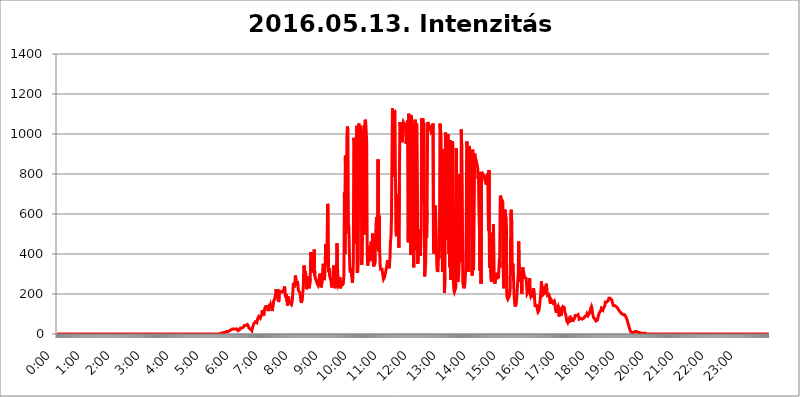
| Category | 2016.05.13. Intenzitás [W/m^2] |
|---|---|
| 0.0 | 0 |
| 0.0006944444444444445 | 0 |
| 0.001388888888888889 | 0 |
| 0.0020833333333333333 | 0 |
| 0.002777777777777778 | 0 |
| 0.003472222222222222 | 0 |
| 0.004166666666666667 | 0 |
| 0.004861111111111111 | 0 |
| 0.005555555555555556 | 0 |
| 0.0062499999999999995 | 0 |
| 0.006944444444444444 | 0 |
| 0.007638888888888889 | 0 |
| 0.008333333333333333 | 0 |
| 0.009027777777777779 | 0 |
| 0.009722222222222222 | 0 |
| 0.010416666666666666 | 0 |
| 0.011111111111111112 | 0 |
| 0.011805555555555555 | 0 |
| 0.012499999999999999 | 0 |
| 0.013194444444444444 | 0 |
| 0.013888888888888888 | 0 |
| 0.014583333333333332 | 0 |
| 0.015277777777777777 | 0 |
| 0.015972222222222224 | 0 |
| 0.016666666666666666 | 0 |
| 0.017361111111111112 | 0 |
| 0.018055555555555557 | 0 |
| 0.01875 | 0 |
| 0.019444444444444445 | 0 |
| 0.02013888888888889 | 0 |
| 0.020833333333333332 | 0 |
| 0.02152777777777778 | 0 |
| 0.022222222222222223 | 0 |
| 0.02291666666666667 | 0 |
| 0.02361111111111111 | 0 |
| 0.024305555555555556 | 0 |
| 0.024999999999999998 | 0 |
| 0.025694444444444447 | 0 |
| 0.02638888888888889 | 0 |
| 0.027083333333333334 | 0 |
| 0.027777777777777776 | 0 |
| 0.02847222222222222 | 0 |
| 0.029166666666666664 | 0 |
| 0.029861111111111113 | 0 |
| 0.030555555555555555 | 0 |
| 0.03125 | 0 |
| 0.03194444444444445 | 0 |
| 0.03263888888888889 | 0 |
| 0.03333333333333333 | 0 |
| 0.034027777777777775 | 0 |
| 0.034722222222222224 | 0 |
| 0.035416666666666666 | 0 |
| 0.036111111111111115 | 0 |
| 0.03680555555555556 | 0 |
| 0.0375 | 0 |
| 0.03819444444444444 | 0 |
| 0.03888888888888889 | 0 |
| 0.03958333333333333 | 0 |
| 0.04027777777777778 | 0 |
| 0.04097222222222222 | 0 |
| 0.041666666666666664 | 0 |
| 0.042361111111111106 | 0 |
| 0.04305555555555556 | 0 |
| 0.043750000000000004 | 0 |
| 0.044444444444444446 | 0 |
| 0.04513888888888889 | 0 |
| 0.04583333333333334 | 0 |
| 0.04652777777777778 | 0 |
| 0.04722222222222222 | 0 |
| 0.04791666666666666 | 0 |
| 0.04861111111111111 | 0 |
| 0.049305555555555554 | 0 |
| 0.049999999999999996 | 0 |
| 0.05069444444444445 | 0 |
| 0.051388888888888894 | 0 |
| 0.052083333333333336 | 0 |
| 0.05277777777777778 | 0 |
| 0.05347222222222222 | 0 |
| 0.05416666666666667 | 0 |
| 0.05486111111111111 | 0 |
| 0.05555555555555555 | 0 |
| 0.05625 | 0 |
| 0.05694444444444444 | 0 |
| 0.057638888888888885 | 0 |
| 0.05833333333333333 | 0 |
| 0.05902777777777778 | 0 |
| 0.059722222222222225 | 0 |
| 0.06041666666666667 | 0 |
| 0.061111111111111116 | 0 |
| 0.06180555555555556 | 0 |
| 0.0625 | 0 |
| 0.06319444444444444 | 0 |
| 0.06388888888888888 | 0 |
| 0.06458333333333334 | 0 |
| 0.06527777777777778 | 0 |
| 0.06597222222222222 | 0 |
| 0.06666666666666667 | 0 |
| 0.06736111111111111 | 0 |
| 0.06805555555555555 | 0 |
| 0.06874999999999999 | 0 |
| 0.06944444444444443 | 0 |
| 0.07013888888888889 | 0 |
| 0.07083333333333333 | 0 |
| 0.07152777777777779 | 0 |
| 0.07222222222222223 | 0 |
| 0.07291666666666667 | 0 |
| 0.07361111111111111 | 0 |
| 0.07430555555555556 | 0 |
| 0.075 | 0 |
| 0.07569444444444444 | 0 |
| 0.0763888888888889 | 0 |
| 0.07708333333333334 | 0 |
| 0.07777777777777778 | 0 |
| 0.07847222222222222 | 0 |
| 0.07916666666666666 | 0 |
| 0.0798611111111111 | 0 |
| 0.08055555555555556 | 0 |
| 0.08125 | 0 |
| 0.08194444444444444 | 0 |
| 0.08263888888888889 | 0 |
| 0.08333333333333333 | 0 |
| 0.08402777777777777 | 0 |
| 0.08472222222222221 | 0 |
| 0.08541666666666665 | 0 |
| 0.08611111111111112 | 0 |
| 0.08680555555555557 | 0 |
| 0.08750000000000001 | 0 |
| 0.08819444444444445 | 0 |
| 0.08888888888888889 | 0 |
| 0.08958333333333333 | 0 |
| 0.09027777777777778 | 0 |
| 0.09097222222222222 | 0 |
| 0.09166666666666667 | 0 |
| 0.09236111111111112 | 0 |
| 0.09305555555555556 | 0 |
| 0.09375 | 0 |
| 0.09444444444444444 | 0 |
| 0.09513888888888888 | 0 |
| 0.09583333333333333 | 0 |
| 0.09652777777777777 | 0 |
| 0.09722222222222222 | 0 |
| 0.09791666666666667 | 0 |
| 0.09861111111111111 | 0 |
| 0.09930555555555555 | 0 |
| 0.09999999999999999 | 0 |
| 0.10069444444444443 | 0 |
| 0.1013888888888889 | 0 |
| 0.10208333333333335 | 0 |
| 0.10277777777777779 | 0 |
| 0.10347222222222223 | 0 |
| 0.10416666666666667 | 0 |
| 0.10486111111111111 | 0 |
| 0.10555555555555556 | 0 |
| 0.10625 | 0 |
| 0.10694444444444444 | 0 |
| 0.1076388888888889 | 0 |
| 0.10833333333333334 | 0 |
| 0.10902777777777778 | 0 |
| 0.10972222222222222 | 0 |
| 0.1111111111111111 | 0 |
| 0.11180555555555556 | 0 |
| 0.11180555555555556 | 0 |
| 0.1125 | 0 |
| 0.11319444444444444 | 0 |
| 0.11388888888888889 | 0 |
| 0.11458333333333333 | 0 |
| 0.11527777777777777 | 0 |
| 0.11597222222222221 | 0 |
| 0.11666666666666665 | 0 |
| 0.1173611111111111 | 0 |
| 0.11805555555555557 | 0 |
| 0.11944444444444445 | 0 |
| 0.12013888888888889 | 0 |
| 0.12083333333333333 | 0 |
| 0.12152777777777778 | 0 |
| 0.12222222222222223 | 0 |
| 0.12291666666666667 | 0 |
| 0.12291666666666667 | 0 |
| 0.12361111111111112 | 0 |
| 0.12430555555555556 | 0 |
| 0.125 | 0 |
| 0.12569444444444444 | 0 |
| 0.12638888888888888 | 0 |
| 0.12708333333333333 | 0 |
| 0.16875 | 0 |
| 0.12847222222222224 | 0 |
| 0.12916666666666668 | 0 |
| 0.12986111111111112 | 0 |
| 0.13055555555555556 | 0 |
| 0.13125 | 0 |
| 0.13194444444444445 | 0 |
| 0.1326388888888889 | 0 |
| 0.13333333333333333 | 0 |
| 0.13402777777777777 | 0 |
| 0.13402777777777777 | 0 |
| 0.13472222222222222 | 0 |
| 0.13541666666666666 | 0 |
| 0.1361111111111111 | 0 |
| 0.13749999999999998 | 0 |
| 0.13819444444444443 | 0 |
| 0.1388888888888889 | 0 |
| 0.13958333333333334 | 0 |
| 0.14027777777777778 | 0 |
| 0.14097222222222222 | 0 |
| 0.14166666666666666 | 0 |
| 0.1423611111111111 | 0 |
| 0.14305555555555557 | 0 |
| 0.14375000000000002 | 0 |
| 0.14444444444444446 | 0 |
| 0.1451388888888889 | 0 |
| 0.1451388888888889 | 0 |
| 0.14652777777777778 | 0 |
| 0.14722222222222223 | 0 |
| 0.14791666666666667 | 0 |
| 0.1486111111111111 | 0 |
| 0.14930555555555555 | 0 |
| 0.15 | 0 |
| 0.15069444444444444 | 0 |
| 0.15138888888888888 | 0 |
| 0.15208333333333332 | 0 |
| 0.15277777777777776 | 0 |
| 0.15347222222222223 | 0 |
| 0.15416666666666667 | 0 |
| 0.15486111111111112 | 0 |
| 0.15555555555555556 | 0 |
| 0.15625 | 0 |
| 0.15694444444444444 | 0 |
| 0.15763888888888888 | 0 |
| 0.15833333333333333 | 0 |
| 0.15902777777777777 | 0 |
| 0.15972222222222224 | 0 |
| 0.16041666666666668 | 0 |
| 0.16111111111111112 | 0 |
| 0.16180555555555556 | 0 |
| 0.1625 | 0 |
| 0.16319444444444445 | 0 |
| 0.1638888888888889 | 0 |
| 0.16458333333333333 | 0 |
| 0.16527777777777777 | 0 |
| 0.16597222222222222 | 0 |
| 0.16666666666666666 | 0 |
| 0.1673611111111111 | 0 |
| 0.16805555555555554 | 0 |
| 0.16874999999999998 | 0 |
| 0.16944444444444443 | 0 |
| 0.17013888888888887 | 0 |
| 0.1708333333333333 | 0 |
| 0.17152777777777775 | 0 |
| 0.17222222222222225 | 0 |
| 0.1729166666666667 | 0 |
| 0.17361111111111113 | 0 |
| 0.17430555555555557 | 0 |
| 0.17500000000000002 | 0 |
| 0.17569444444444446 | 0 |
| 0.1763888888888889 | 0 |
| 0.17708333333333334 | 0 |
| 0.17777777777777778 | 0 |
| 0.17847222222222223 | 0 |
| 0.17916666666666667 | 0 |
| 0.1798611111111111 | 0 |
| 0.18055555555555555 | 0 |
| 0.18125 | 0 |
| 0.18194444444444444 | 0 |
| 0.1826388888888889 | 0 |
| 0.18333333333333335 | 0 |
| 0.1840277777777778 | 0 |
| 0.18472222222222223 | 0 |
| 0.18541666666666667 | 0 |
| 0.18611111111111112 | 0 |
| 0.18680555555555556 | 0 |
| 0.1875 | 0 |
| 0.18819444444444444 | 0 |
| 0.18888888888888888 | 0 |
| 0.18958333333333333 | 0 |
| 0.19027777777777777 | 0 |
| 0.1909722222222222 | 0 |
| 0.19166666666666665 | 0 |
| 0.19236111111111112 | 0 |
| 0.19305555555555554 | 0 |
| 0.19375 | 0 |
| 0.19444444444444445 | 0 |
| 0.1951388888888889 | 0 |
| 0.19583333333333333 | 0 |
| 0.19652777777777777 | 0 |
| 0.19722222222222222 | 0 |
| 0.19791666666666666 | 0 |
| 0.1986111111111111 | 0 |
| 0.19930555555555554 | 0 |
| 0.19999999999999998 | 0 |
| 0.20069444444444443 | 0 |
| 0.20138888888888887 | 0 |
| 0.2020833333333333 | 0 |
| 0.2027777777777778 | 0 |
| 0.2034722222222222 | 0 |
| 0.2041666666666667 | 0 |
| 0.20486111111111113 | 0 |
| 0.20555555555555557 | 0 |
| 0.20625000000000002 | 0 |
| 0.20694444444444446 | 0 |
| 0.2076388888888889 | 0 |
| 0.20833333333333334 | 0 |
| 0.20902777777777778 | 0 |
| 0.20972222222222223 | 0 |
| 0.21041666666666667 | 0 |
| 0.2111111111111111 | 0 |
| 0.21180555555555555 | 0 |
| 0.2125 | 0 |
| 0.21319444444444444 | 0 |
| 0.2138888888888889 | 0 |
| 0.21458333333333335 | 0 |
| 0.2152777777777778 | 0 |
| 0.21597222222222223 | 0 |
| 0.21666666666666667 | 0 |
| 0.21736111111111112 | 0 |
| 0.21805555555555556 | 0 |
| 0.21875 | 0 |
| 0.21944444444444444 | 0 |
| 0.22013888888888888 | 0 |
| 0.22083333333333333 | 0 |
| 0.22152777777777777 | 0 |
| 0.2222222222222222 | 0 |
| 0.22291666666666665 | 0 |
| 0.2236111111111111 | 0 |
| 0.22430555555555556 | 0 |
| 0.225 | 0 |
| 0.22569444444444445 | 0 |
| 0.2263888888888889 | 0 |
| 0.22708333333333333 | 0 |
| 0.22777777777777777 | 0 |
| 0.22847222222222222 | 3.525 |
| 0.22916666666666666 | 3.525 |
| 0.2298611111111111 | 3.525 |
| 0.23055555555555554 | 3.525 |
| 0.23124999999999998 | 3.525 |
| 0.23194444444444443 | 3.525 |
| 0.23263888888888887 | 7.887 |
| 0.2333333333333333 | 7.887 |
| 0.2340277777777778 | 7.887 |
| 0.2347222222222222 | 7.887 |
| 0.2354166666666667 | 7.887 |
| 0.23611111111111113 | 7.887 |
| 0.23680555555555557 | 12.257 |
| 0.23750000000000002 | 12.257 |
| 0.23819444444444446 | 12.257 |
| 0.2388888888888889 | 12.257 |
| 0.23958333333333334 | 12.257 |
| 0.24027777777777778 | 16.636 |
| 0.24097222222222223 | 16.636 |
| 0.24166666666666667 | 16.636 |
| 0.2423611111111111 | 16.636 |
| 0.24305555555555555 | 21.024 |
| 0.24375 | 21.024 |
| 0.24444444444444446 | 21.024 |
| 0.24513888888888888 | 21.024 |
| 0.24583333333333335 | 25.419 |
| 0.2465277777777778 | 25.419 |
| 0.24722222222222223 | 25.419 |
| 0.24791666666666667 | 25.419 |
| 0.24861111111111112 | 25.419 |
| 0.24930555555555556 | 25.419 |
| 0.25 | 25.419 |
| 0.25069444444444444 | 29.823 |
| 0.2513888888888889 | 29.823 |
| 0.2520833333333333 | 25.419 |
| 0.25277777777777777 | 21.024 |
| 0.2534722222222222 | 16.636 |
| 0.25416666666666665 | 16.636 |
| 0.2548611111111111 | 16.636 |
| 0.2555555555555556 | 21.024 |
| 0.25625000000000003 | 21.024 |
| 0.2569444444444445 | 29.823 |
| 0.2576388888888889 | 29.823 |
| 0.25833333333333336 | 25.419 |
| 0.2590277777777778 | 29.823 |
| 0.25972222222222224 | 29.823 |
| 0.2604166666666667 | 34.234 |
| 0.2611111111111111 | 34.234 |
| 0.26180555555555557 | 34.234 |
| 0.2625 | 43.079 |
| 0.26319444444444445 | 47.511 |
| 0.2638888888888889 | 47.511 |
| 0.26458333333333334 | 43.079 |
| 0.2652777777777778 | 43.079 |
| 0.2659722222222222 | 38.653 |
| 0.26666666666666666 | 47.511 |
| 0.2673611111111111 | 43.079 |
| 0.26805555555555555 | 38.653 |
| 0.26875 | 29.823 |
| 0.26944444444444443 | 29.823 |
| 0.2701388888888889 | 29.823 |
| 0.2708333333333333 | 25.419 |
| 0.27152777777777776 | 21.024 |
| 0.2722222222222222 | 21.024 |
| 0.27291666666666664 | 16.636 |
| 0.2736111111111111 | 29.823 |
| 0.2743055555555555 | 25.419 |
| 0.27499999999999997 | 43.079 |
| 0.27569444444444446 | 51.951 |
| 0.27638888888888885 | 47.511 |
| 0.27708333333333335 | 51.951 |
| 0.2777777777777778 | 60.85 |
| 0.27847222222222223 | 56.398 |
| 0.2791666666666667 | 56.398 |
| 0.2798611111111111 | 56.398 |
| 0.28055555555555556 | 60.85 |
| 0.28125 | 78.722 |
| 0.28194444444444444 | 83.205 |
| 0.2826388888888889 | 87.692 |
| 0.2833333333333333 | 83.205 |
| 0.28402777777777777 | 87.692 |
| 0.2847222222222222 | 78.722 |
| 0.28541666666666665 | 74.246 |
| 0.28611111111111115 | 74.246 |
| 0.28680555555555554 | 96.682 |
| 0.28750000000000003 | 119.235 |
| 0.2881944444444445 | 123.758 |
| 0.2888888888888889 | 105.69 |
| 0.28958333333333336 | 92.184 |
| 0.2902777777777778 | 110.201 |
| 0.29097222222222224 | 128.284 |
| 0.2916666666666667 | 132.814 |
| 0.2923611111111111 | 137.347 |
| 0.29305555555555557 | 137.347 |
| 0.29375 | 141.884 |
| 0.29444444444444445 | 137.347 |
| 0.2951388888888889 | 123.758 |
| 0.29583333333333334 | 114.716 |
| 0.2965277777777778 | 128.284 |
| 0.2972222222222222 | 141.884 |
| 0.29791666666666666 | 150.964 |
| 0.2986111111111111 | 137.347 |
| 0.29930555555555555 | 146.423 |
| 0.3 | 146.423 |
| 0.30069444444444443 | 128.284 |
| 0.3013888888888889 | 114.716 |
| 0.3020833333333333 | 132.814 |
| 0.30277777777777776 | 141.884 |
| 0.3034722222222222 | 164.605 |
| 0.30416666666666664 | 169.156 |
| 0.3048611111111111 | 173.709 |
| 0.3055555555555555 | 169.156 |
| 0.30624999999999997 | 201.058 |
| 0.3069444444444444 | 223.873 |
| 0.3076388888888889 | 219.309 |
| 0.30833333333333335 | 201.058 |
| 0.3090277777777778 | 182.82 |
| 0.30972222222222223 | 173.709 |
| 0.3104166666666667 | 160.056 |
| 0.3111111111111111 | 169.156 |
| 0.31180555555555556 | 214.746 |
| 0.3125 | 219.309 |
| 0.31319444444444444 | 210.182 |
| 0.3138888888888889 | 210.182 |
| 0.3145833333333333 | 214.746 |
| 0.31527777777777777 | 214.746 |
| 0.3159722222222222 | 210.182 |
| 0.31666666666666665 | 210.182 |
| 0.31736111111111115 | 210.182 |
| 0.31805555555555554 | 223.873 |
| 0.31875000000000003 | 237.564 |
| 0.3194444444444445 | 210.182 |
| 0.3201388888888889 | 182.82 |
| 0.32083333333333336 | 201.058 |
| 0.3215277777777778 | 196.497 |
| 0.32222222222222224 | 164.605 |
| 0.3229166666666667 | 141.884 |
| 0.3236111111111111 | 164.605 |
| 0.32430555555555557 | 187.378 |
| 0.325 | 164.605 |
| 0.32569444444444445 | 160.056 |
| 0.3263888888888889 | 155.509 |
| 0.32708333333333334 | 160.056 |
| 0.3277777777777778 | 160.056 |
| 0.3284722222222222 | 146.423 |
| 0.32916666666666666 | 155.509 |
| 0.3298611111111111 | 173.709 |
| 0.33055555555555555 | 219.309 |
| 0.33125 | 255.813 |
| 0.33194444444444443 | 233 |
| 0.3326388888888889 | 233 |
| 0.3333333333333333 | 255.813 |
| 0.3340277777777778 | 292.259 |
| 0.3347222222222222 | 292.259 |
| 0.3354166666666667 | 251.251 |
| 0.3361111111111111 | 242.127 |
| 0.3368055555555556 | 264.932 |
| 0.33749999999999997 | 242.127 |
| 0.33819444444444446 | 219.309 |
| 0.33888888888888885 | 219.309 |
| 0.33958333333333335 | 219.309 |
| 0.34027777777777773 | 205.62 |
| 0.34097222222222223 | 191.937 |
| 0.3416666666666666 | 164.605 |
| 0.3423611111111111 | 155.509 |
| 0.3430555555555555 | 155.509 |
| 0.34375 | 178.264 |
| 0.3444444444444445 | 182.82 |
| 0.3451388888888889 | 237.564 |
| 0.3458333333333334 | 342.162 |
| 0.34652777777777777 | 333.113 |
| 0.34722222222222227 | 296.808 |
| 0.34791666666666665 | 314.98 |
| 0.34861111111111115 | 292.259 |
| 0.34930555555555554 | 223.873 |
| 0.35000000000000003 | 228.436 |
| 0.3506944444444444 | 237.564 |
| 0.3513888888888889 | 269.49 |
| 0.3520833333333333 | 287.709 |
| 0.3527777777777778 | 264.932 |
| 0.3534722222222222 | 228.436 |
| 0.3541666666666667 | 233 |
| 0.3548611111111111 | 274.047 |
| 0.35555555555555557 | 409.574 |
| 0.35625 | 387.202 |
| 0.35694444444444445 | 391.685 |
| 0.3576388888888889 | 337.639 |
| 0.35833333333333334 | 337.639 |
| 0.3590277777777778 | 305.898 |
| 0.3597222222222222 | 351.198 |
| 0.36041666666666666 | 422.943 |
| 0.3611111111111111 | 292.259 |
| 0.36180555555555555 | 283.156 |
| 0.3625 | 274.047 |
| 0.36319444444444443 | 274.047 |
| 0.3638888888888889 | 260.373 |
| 0.3645833333333333 | 251.251 |
| 0.3652777777777778 | 246.689 |
| 0.3659722222222222 | 242.127 |
| 0.3666666666666667 | 251.251 |
| 0.3673611111111111 | 278.603 |
| 0.3680555555555556 | 301.354 |
| 0.36874999999999997 | 287.709 |
| 0.36944444444444446 | 260.373 |
| 0.37013888888888885 | 233 |
| 0.37083333333333335 | 237.564 |
| 0.37152777777777773 | 269.49 |
| 0.37222222222222223 | 310.44 |
| 0.3729166666666666 | 351.198 |
| 0.3736111111111111 | 337.639 |
| 0.3743055555555555 | 269.49 |
| 0.375 | 283.156 |
| 0.3756944444444445 | 324.052 |
| 0.3763888888888889 | 449.551 |
| 0.3770833333333334 | 342.162 |
| 0.37777777777777777 | 360.221 |
| 0.37847222222222227 | 449.551 |
| 0.37916666666666665 | 650.667 |
| 0.37986111111111115 | 642.4 |
| 0.38055555555555554 | 310.44 |
| 0.38125000000000003 | 328.584 |
| 0.3819444444444444 | 292.259 |
| 0.3826388888888889 | 287.709 |
| 0.3833333333333333 | 292.259 |
| 0.3840277777777778 | 264.932 |
| 0.3847222222222222 | 233 |
| 0.3854166666666667 | 233 |
| 0.3861111111111111 | 255.813 |
| 0.38680555555555557 | 305.898 |
| 0.3875 | 342.162 |
| 0.38819444444444445 | 342.162 |
| 0.3888888888888889 | 287.709 |
| 0.38958333333333334 | 228.436 |
| 0.3902777777777778 | 233 |
| 0.3909722222222222 | 283.156 |
| 0.39166666666666666 | 328.584 |
| 0.3923611111111111 | 453.968 |
| 0.39305555555555555 | 337.639 |
| 0.39375 | 278.603 |
| 0.39444444444444443 | 242.127 |
| 0.3951388888888889 | 246.689 |
| 0.3958333333333333 | 251.251 |
| 0.3965277777777778 | 283.156 |
| 0.3972222222222222 | 228.436 |
| 0.3979166666666667 | 228.436 |
| 0.3986111111111111 | 233 |
| 0.3993055555555556 | 264.932 |
| 0.39999999999999997 | 242.127 |
| 0.40069444444444446 | 246.689 |
| 0.40138888888888885 | 260.373 |
| 0.40208333333333335 | 296.808 |
| 0.40277777777777773 | 707.8 |
| 0.40347222222222223 | 400.638 |
| 0.4041666666666666 | 891.099 |
| 0.4048611111111111 | 502.192 |
| 0.4055555555555555 | 575.299 |
| 0.40625 | 988.714 |
| 0.4069444444444445 | 1037.277 |
| 0.4076388888888889 | 1022.323 |
| 0.4083333333333334 | 553.986 |
| 0.40902777777777777 | 532.513 |
| 0.40972222222222227 | 409.574 |
| 0.41041666666666665 | 324.052 |
| 0.41111111111111115 | 305.898 |
| 0.41180555555555554 | 328.584 |
| 0.41250000000000003 | 333.113 |
| 0.4131944444444444 | 287.709 |
| 0.4138888888888889 | 255.813 |
| 0.4145833333333333 | 283.156 |
| 0.4152777777777778 | 360.221 |
| 0.4159722222222222 | 981.244 |
| 0.4166666666666667 | 958.814 |
| 0.4173611111111111 | 453.968 |
| 0.41805555555555557 | 497.836 |
| 0.41875 | 458.38 |
| 0.41944444444444445 | 634.105 |
| 0.4201388888888889 | 1041.019 |
| 0.42083333333333334 | 305.898 |
| 0.4215277777777778 | 314.98 |
| 0.4222222222222222 | 373.729 |
| 0.42291666666666666 | 1052.255 |
| 0.4236111111111111 | 1037.277 |
| 0.42430555555555555 | 1026.06 |
| 0.425 | 1041.019 |
| 0.42569444444444443 | 1041.019 |
| 0.4263888888888889 | 868.305 |
| 0.4270833333333333 | 346.682 |
| 0.4277777777777778 | 489.108 |
| 0.4284722222222222 | 1022.323 |
| 0.4291666666666667 | 1022.323 |
| 0.4298611111111111 | 921.298 |
| 0.4305555555555556 | 1044.762 |
| 0.43124999999999997 | 497.836 |
| 0.43194444444444446 | 1071.027 |
| 0.43263888888888885 | 1059.756 |
| 0.43333333333333335 | 1059.756 |
| 0.43402777777777773 | 958.814 |
| 0.43472222222222223 | 409.574 |
| 0.4354166666666666 | 342.162 |
| 0.4361111111111111 | 360.221 |
| 0.4368055555555555 | 440.702 |
| 0.4375 | 387.202 |
| 0.4381944444444445 | 364.728 |
| 0.4388888888888889 | 360.221 |
| 0.4395833333333334 | 378.224 |
| 0.44027777777777777 | 462.786 |
| 0.44097222222222227 | 405.108 |
| 0.44166666666666665 | 431.833 |
| 0.44236111111111115 | 502.192 |
| 0.44305555555555554 | 369.23 |
| 0.44375000000000003 | 337.639 |
| 0.4444444444444444 | 337.639 |
| 0.4451388888888889 | 337.639 |
| 0.4458333333333333 | 360.221 |
| 0.4465277777777778 | 484.735 |
| 0.4472222222222222 | 553.986 |
| 0.4479166666666667 | 583.779 |
| 0.4486111111111111 | 541.121 |
| 0.44930555555555557 | 449.551 |
| 0.45 | 872.114 |
| 0.45069444444444445 | 414.035 |
| 0.4513888888888889 | 592.233 |
| 0.45208333333333334 | 431.833 |
| 0.4527777777777778 | 351.198 |
| 0.4534722222222222 | 324.052 |
| 0.45416666666666666 | 319.517 |
| 0.4548611111111111 | 324.052 |
| 0.45555555555555555 | 324.052 |
| 0.45625 | 305.898 |
| 0.45694444444444443 | 287.709 |
| 0.4576388888888889 | 274.047 |
| 0.4583333333333333 | 274.047 |
| 0.4590277777777778 | 283.156 |
| 0.4597222222222222 | 296.808 |
| 0.4604166666666667 | 305.898 |
| 0.4611111111111111 | 305.898 |
| 0.4618055555555556 | 333.113 |
| 0.46249999999999997 | 351.198 |
| 0.46319444444444446 | 369.23 |
| 0.46388888888888885 | 346.682 |
| 0.46458333333333335 | 337.639 |
| 0.46527777777777773 | 328.584 |
| 0.46597222222222223 | 342.162 |
| 0.4666666666666666 | 378.224 |
| 0.4673611111111111 | 462.786 |
| 0.4680555555555555 | 484.735 |
| 0.46875 | 579.542 |
| 0.4694444444444445 | 875.918 |
| 0.4701388888888889 | 1127.879 |
| 0.4708333333333334 | 1059.756 |
| 0.47152777777777777 | 856.855 |
| 0.47222222222222227 | 787.258 |
| 0.47291666666666665 | 1120.238 |
| 0.47361111111111115 | 1108.816 |
| 0.47430555555555554 | 802.868 |
| 0.47500000000000003 | 519.555 |
| 0.4756944444444444 | 489.108 |
| 0.4763888888888889 | 493.475 |
| 0.4770833333333333 | 699.717 |
| 0.4777777777777778 | 609.062 |
| 0.4784722222222222 | 536.82 |
| 0.4791666666666667 | 431.833 |
| 0.4798611111111111 | 751.803 |
| 0.48055555555555557 | 1059.756 |
| 0.48125 | 1037.277 |
| 0.48194444444444445 | 1037.277 |
| 0.4826388888888889 | 1037.277 |
| 0.48333333333333334 | 1029.798 |
| 0.4840277777777778 | 958.814 |
| 0.4847222222222222 | 1048.508 |
| 0.48541666666666666 | 1059.756 |
| 0.4861111111111111 | 1063.51 |
| 0.48680555555555555 | 1048.508 |
| 0.4875 | 1044.762 |
| 0.48819444444444443 | 1033.537 |
| 0.4888888888888889 | 1044.762 |
| 0.4895833333333333 | 951.327 |
| 0.4902777777777778 | 1052.255 |
| 0.4909722222222222 | 1059.756 |
| 0.4916666666666667 | 1067.267 |
| 0.4923611111111111 | 458.38 |
| 0.4930555555555556 | 1101.226 |
| 0.49374999999999997 | 691.608 |
| 0.49444444444444446 | 763.674 |
| 0.49513888888888885 | 691.608 |
| 0.49583333333333335 | 396.164 |
| 0.49652777777777773 | 1093.653 |
| 0.49722222222222223 | 1067.267 |
| 0.4979166666666666 | 1063.51 |
| 0.4986111111111111 | 1044.762 |
| 0.4993055555555555 | 837.682 |
| 0.5 | 333.113 |
| 0.5006944444444444 | 913.766 |
| 0.5013888888888889 | 822.26 |
| 0.5020833333333333 | 1071.027 |
| 0.5027777777777778 | 418.492 |
| 0.5034722222222222 | 1044.762 |
| 0.5041666666666667 | 1052.255 |
| 0.5048611111111111 | 1048.508 |
| 0.5055555555555555 | 351.198 |
| 0.50625 | 382.715 |
| 0.5069444444444444 | 427.39 |
| 0.5076388888888889 | 489.108 |
| 0.5083333333333333 | 523.88 |
| 0.5090277777777777 | 391.685 |
| 0.5097222222222222 | 436.27 |
| 0.5104166666666666 | 523.88 |
| 0.5111111111111112 | 1078.555 |
| 0.5118055555555555 | 658.909 |
| 0.5125000000000001 | 1078.555 |
| 0.5131944444444444 | 1059.756 |
| 0.513888888888889 | 1063.51 |
| 0.5145833333333333 | 1048.508 |
| 0.5152777777777778 | 287.709 |
| 0.5159722222222222 | 319.517 |
| 0.5166666666666667 | 351.198 |
| 0.517361111111111 | 502.192 |
| 0.5180555555555556 | 480.356 |
| 0.5187499999999999 | 617.436 |
| 0.5194444444444445 | 1059.756 |
| 0.5201388888888888 | 1052.255 |
| 0.5208333333333334 | 1048.508 |
| 0.5215277777777778 | 1044.762 |
| 0.5222222222222223 | 1044.762 |
| 0.5229166666666667 | 1029.798 |
| 0.5236111111111111 | 1022.323 |
| 0.5243055555555556 | 1011.118 |
| 0.525 | 1014.852 |
| 0.5256944444444445 | 1018.587 |
| 0.5263888888888889 | 1026.06 |
| 0.5270833333333333 | 1052.255 |
| 0.5277777777777778 | 418.492 |
| 0.5284722222222222 | 400.638 |
| 0.5291666666666667 | 436.27 |
| 0.5298611111111111 | 642.4 |
| 0.5305555555555556 | 617.436 |
| 0.53125 | 532.513 |
| 0.5319444444444444 | 405.108 |
| 0.5326388888888889 | 324.052 |
| 0.5333333333333333 | 310.44 |
| 0.5340277777777778 | 319.517 |
| 0.5347222222222222 | 391.685 |
| 0.5354166666666667 | 378.224 |
| 0.5361111111111111 | 515.223 |
| 0.5368055555555555 | 1052.255 |
| 0.5375 | 1022.323 |
| 0.5381944444444444 | 999.916 |
| 0.5388888888888889 | 996.182 |
| 0.5395833333333333 | 1003.65 |
| 0.5402777777777777 | 310.44 |
| 0.5409722222222222 | 328.584 |
| 0.5416666666666666 | 925.06 |
| 0.5423611111111112 | 767.62 |
| 0.5430555555555555 | 205.62 |
| 0.5437500000000001 | 283.156 |
| 0.5444444444444444 | 1007.383 |
| 0.545138888888889 | 992.448 |
| 0.5458333333333333 | 992.448 |
| 0.5465277777777778 | 864.493 |
| 0.5472222222222222 | 471.582 |
| 0.5479166666666667 | 999.916 |
| 0.548611111111111 | 763.674 |
| 0.5493055555555556 | 400.638 |
| 0.5499999999999999 | 775.492 |
| 0.5506944444444445 | 333.113 |
| 0.5513888888888888 | 970.034 |
| 0.5520833333333334 | 269.49 |
| 0.5527777777777778 | 691.608 |
| 0.5534722222222223 | 947.58 |
| 0.5541666666666667 | 962.555 |
| 0.5548611111111111 | 951.327 |
| 0.5555555555555556 | 269.49 |
| 0.55625 | 219.309 |
| 0.5569444444444445 | 210.182 |
| 0.5576388888888889 | 210.182 |
| 0.5583333333333333 | 210.182 |
| 0.5590277777777778 | 233 |
| 0.5597222222222222 | 928.819 |
| 0.5604166666666667 | 287.709 |
| 0.5611111111111111 | 296.808 |
| 0.5618055555555556 | 260.373 |
| 0.5625 | 274.047 |
| 0.5631944444444444 | 310.44 |
| 0.5638888888888889 | 378.224 |
| 0.5645833333333333 | 798.974 |
| 0.5652777777777778 | 360.221 |
| 0.5659722222222222 | 405.108 |
| 0.5666666666666667 | 1022.323 |
| 0.5673611111111111 | 921.298 |
| 0.5680555555555555 | 719.877 |
| 0.56875 | 260.373 |
| 0.5694444444444444 | 242.127 |
| 0.5701388888888889 | 228.436 |
| 0.5708333333333333 | 233 |
| 0.5715277777777777 | 246.689 |
| 0.5722222222222222 | 278.603 |
| 0.5729166666666666 | 328.584 |
| 0.5736111111111112 | 553.986 |
| 0.5743055555555555 | 962.555 |
| 0.5750000000000001 | 947.58 |
| 0.5756944444444444 | 324.052 |
| 0.576388888888889 | 936.33 |
| 0.5770833333333333 | 310.44 |
| 0.5777777777777778 | 940.082 |
| 0.5784722222222222 | 925.06 |
| 0.5791666666666667 | 906.223 |
| 0.579861111111111 | 898.668 |
| 0.5805555555555556 | 887.309 |
| 0.5812499999999999 | 887.309 |
| 0.5819444444444445 | 292.259 |
| 0.5826388888888888 | 921.298 |
| 0.5833333333333334 | 319.517 |
| 0.5840277777777778 | 337.639 |
| 0.5847222222222223 | 609.062 |
| 0.5854166666666667 | 902.447 |
| 0.5861111111111111 | 887.309 |
| 0.5868055555555556 | 875.918 |
| 0.5875 | 868.305 |
| 0.5881944444444445 | 856.855 |
| 0.5888888888888889 | 845.365 |
| 0.5895833333333333 | 833.834 |
| 0.5902777777777778 | 775.492 |
| 0.5909722222222222 | 810.641 |
| 0.5916666666666667 | 810.641 |
| 0.5923611111111111 | 806.757 |
| 0.5930555555555556 | 314.98 |
| 0.59375 | 667.123 |
| 0.5944444444444444 | 251.251 |
| 0.5951388888888889 | 810.641 |
| 0.5958333333333333 | 806.757 |
| 0.5965277777777778 | 798.974 |
| 0.5972222222222222 | 791.169 |
| 0.5979166666666667 | 798.974 |
| 0.5986111111111111 | 783.342 |
| 0.5993055555555555 | 791.169 |
| 0.6 | 775.492 |
| 0.6006944444444444 | 775.492 |
| 0.6013888888888889 | 747.834 |
| 0.6020833333333333 | 763.674 |
| 0.6027777777777777 | 767.62 |
| 0.6034722222222222 | 767.62 |
| 0.6041666666666666 | 802.868 |
| 0.6048611111111112 | 515.223 |
| 0.6055555555555555 | 818.392 |
| 0.6062500000000001 | 333.113 |
| 0.6069444444444444 | 333.113 |
| 0.607638888888889 | 396.164 |
| 0.6083333333333333 | 278.603 |
| 0.6090277777777778 | 260.373 |
| 0.6097222222222222 | 274.047 |
| 0.6104166666666667 | 506.542 |
| 0.611111111111111 | 310.44 |
| 0.6118055555555556 | 549.704 |
| 0.6124999999999999 | 274.047 |
| 0.6131944444444445 | 264.932 |
| 0.6138888888888888 | 251.251 |
| 0.6145833333333334 | 278.603 |
| 0.6152777777777778 | 305.898 |
| 0.6159722222222223 | 296.808 |
| 0.6166666666666667 | 278.603 |
| 0.6173611111111111 | 274.047 |
| 0.6180555555555556 | 278.603 |
| 0.61875 | 283.156 |
| 0.6194444444444445 | 283.156 |
| 0.6201388888888889 | 373.729 |
| 0.6208333333333333 | 333.113 |
| 0.6215277777777778 | 691.608 |
| 0.6222222222222222 | 683.473 |
| 0.6229166666666667 | 675.311 |
| 0.6236111111111111 | 675.311 |
| 0.6243055555555556 | 667.123 |
| 0.625 | 658.909 |
| 0.6256944444444444 | 278.603 |
| 0.6263888888888889 | 228.436 |
| 0.6270833333333333 | 233 |
| 0.6277777777777778 | 621.613 |
| 0.6284722222222222 | 600.661 |
| 0.6291666666666667 | 588.009 |
| 0.6298611111111111 | 575.299 |
| 0.6305555555555555 | 187.378 |
| 0.63125 | 182.82 |
| 0.6319444444444444 | 173.709 |
| 0.6326388888888889 | 173.709 |
| 0.6333333333333333 | 182.82 |
| 0.6340277777777777 | 191.937 |
| 0.6347222222222222 | 205.62 |
| 0.6354166666666666 | 233 |
| 0.6361111111111112 | 600.661 |
| 0.6368055555555555 | 621.613 |
| 0.6375000000000001 | 549.704 |
| 0.6381944444444444 | 319.517 |
| 0.638888888888889 | 351.198 |
| 0.6395833333333333 | 328.584 |
| 0.6402777777777778 | 237.564 |
| 0.6409722222222222 | 182.82 |
| 0.6416666666666667 | 150.964 |
| 0.642361111111111 | 137.347 |
| 0.6430555555555556 | 137.347 |
| 0.6437499999999999 | 155.509 |
| 0.6444444444444445 | 178.264 |
| 0.6451388888888888 | 219.309 |
| 0.6458333333333334 | 260.373 |
| 0.6465277777777778 | 301.354 |
| 0.6472222222222223 | 462.786 |
| 0.6479166666666667 | 324.052 |
| 0.6486111111111111 | 319.517 |
| 0.6493055555555556 | 278.603 |
| 0.65 | 260.373 |
| 0.6506944444444445 | 310.44 |
| 0.6513888888888889 | 201.058 |
| 0.6520833333333333 | 237.564 |
| 0.6527777777777778 | 333.113 |
| 0.6534722222222222 | 319.517 |
| 0.6541666666666667 | 310.44 |
| 0.6548611111111111 | 296.808 |
| 0.6555555555555556 | 283.156 |
| 0.65625 | 278.603 |
| 0.6569444444444444 | 278.603 |
| 0.6576388888888889 | 278.603 |
| 0.6583333333333333 | 283.156 |
| 0.6590277777777778 | 201.058 |
| 0.6597222222222222 | 196.497 |
| 0.6604166666666667 | 210.182 |
| 0.6611111111111111 | 228.436 |
| 0.6618055555555555 | 237.564 |
| 0.6625 | 278.603 |
| 0.6631944444444444 | 201.058 |
| 0.6638888888888889 | 191.937 |
| 0.6645833333333333 | 201.058 |
| 0.6652777777777777 | 205.62 |
| 0.6659722222222222 | 219.309 |
| 0.6666666666666666 | 191.937 |
| 0.6673611111111111 | 182.82 |
| 0.6680555555555556 | 228.436 |
| 0.6687500000000001 | 228.436 |
| 0.6694444444444444 | 178.264 |
| 0.6701388888888888 | 141.884 |
| 0.6708333333333334 | 146.423 |
| 0.6715277777777778 | 146.423 |
| 0.6722222222222222 | 141.884 |
| 0.6729166666666666 | 132.814 |
| 0.6736111111111112 | 119.235 |
| 0.6743055555555556 | 110.201 |
| 0.6749999999999999 | 110.201 |
| 0.6756944444444444 | 119.235 |
| 0.6763888888888889 | 141.884 |
| 0.6770833333333334 | 164.605 |
| 0.6777777777777777 | 187.378 |
| 0.6784722222222223 | 219.309 |
| 0.6791666666666667 | 264.932 |
| 0.6798611111111111 | 210.182 |
| 0.6805555555555555 | 205.62 |
| 0.68125 | 196.497 |
| 0.6819444444444445 | 196.497 |
| 0.6826388888888889 | 201.058 |
| 0.6833333333333332 | 205.62 |
| 0.6840277777777778 | 237.564 |
| 0.6847222222222222 | 219.309 |
| 0.6854166666666667 | 219.309 |
| 0.686111111111111 | 251.251 |
| 0.6868055555555556 | 201.058 |
| 0.6875 | 191.937 |
| 0.6881944444444444 | 196.497 |
| 0.688888888888889 | 196.497 |
| 0.6895833333333333 | 196.497 |
| 0.6902777777777778 | 182.82 |
| 0.6909722222222222 | 164.605 |
| 0.6916666666666668 | 150.964 |
| 0.6923611111111111 | 173.709 |
| 0.6930555555555555 | 173.709 |
| 0.69375 | 164.605 |
| 0.6944444444444445 | 160.056 |
| 0.6951388888888889 | 155.509 |
| 0.6958333333333333 | 155.509 |
| 0.6965277777777777 | 155.509 |
| 0.6972222222222223 | 164.605 |
| 0.6979166666666666 | 155.509 |
| 0.6986111111111111 | 128.284 |
| 0.6993055555555556 | 114.716 |
| 0.7000000000000001 | 105.69 |
| 0.7006944444444444 | 128.284 |
| 0.7013888888888888 | 128.284 |
| 0.7020833333333334 | 137.347 |
| 0.7027777777777778 | 137.347 |
| 0.7034722222222222 | 96.682 |
| 0.7041666666666666 | 87.692 |
| 0.7048611111111112 | 123.758 |
| 0.7055555555555556 | 119.235 |
| 0.7062499999999999 | 114.716 |
| 0.7069444444444444 | 92.184 |
| 0.7076388888888889 | 128.284 |
| 0.7083333333333334 | 128.284 |
| 0.7090277777777777 | 137.347 |
| 0.7097222222222223 | 137.347 |
| 0.7104166666666667 | 137.347 |
| 0.7111111111111111 | 132.814 |
| 0.7118055555555555 | 110.201 |
| 0.7125 | 105.69 |
| 0.7131944444444445 | 96.682 |
| 0.7138888888888889 | 83.205 |
| 0.7145833333333332 | 65.31 |
| 0.7152777777777778 | 60.85 |
| 0.7159722222222222 | 56.398 |
| 0.7166666666666667 | 60.85 |
| 0.717361111111111 | 69.775 |
| 0.7180555555555556 | 56.398 |
| 0.71875 | 74.246 |
| 0.7194444444444444 | 78.722 |
| 0.720138888888889 | 83.205 |
| 0.7208333333333333 | 83.205 |
| 0.7215277777777778 | 83.205 |
| 0.7222222222222222 | 74.246 |
| 0.7229166666666668 | 60.85 |
| 0.7236111111111111 | 69.775 |
| 0.7243055555555555 | 65.31 |
| 0.725 | 65.31 |
| 0.7256944444444445 | 78.722 |
| 0.7263888888888889 | 92.184 |
| 0.7270833333333333 | 92.184 |
| 0.7277777777777777 | 92.184 |
| 0.7284722222222223 | 92.184 |
| 0.7291666666666666 | 96.682 |
| 0.7298611111111111 | 96.682 |
| 0.7305555555555556 | 96.682 |
| 0.7312500000000001 | 92.184 |
| 0.7319444444444444 | 74.246 |
| 0.7326388888888888 | 74.246 |
| 0.7333333333333334 | 78.722 |
| 0.7340277777777778 | 78.722 |
| 0.7347222222222222 | 74.246 |
| 0.7354166666666666 | 74.246 |
| 0.7361111111111112 | 74.246 |
| 0.7368055555555556 | 74.246 |
| 0.7374999999999999 | 78.722 |
| 0.7381944444444444 | 78.722 |
| 0.7388888888888889 | 83.205 |
| 0.7395833333333334 | 83.205 |
| 0.7402777777777777 | 87.692 |
| 0.7409722222222223 | 92.184 |
| 0.7416666666666667 | 92.184 |
| 0.7423611111111111 | 92.184 |
| 0.7430555555555555 | 101.184 |
| 0.74375 | 96.682 |
| 0.7444444444444445 | 92.184 |
| 0.7451388888888889 | 92.184 |
| 0.7458333333333332 | 96.682 |
| 0.7465277777777778 | 105.69 |
| 0.7472222222222222 | 114.716 |
| 0.7479166666666667 | 123.758 |
| 0.748611111111111 | 128.284 |
| 0.7493055555555556 | 137.347 |
| 0.75 | 128.284 |
| 0.7506944444444444 | 105.69 |
| 0.751388888888889 | 92.184 |
| 0.7520833333333333 | 83.205 |
| 0.7527777777777778 | 78.722 |
| 0.7534722222222222 | 78.722 |
| 0.7541666666666668 | 74.246 |
| 0.7548611111111111 | 69.775 |
| 0.7555555555555555 | 65.31 |
| 0.75625 | 65.31 |
| 0.7569444444444445 | 65.31 |
| 0.7576388888888889 | 69.775 |
| 0.7583333333333333 | 74.246 |
| 0.7590277777777777 | 92.184 |
| 0.7597222222222223 | 101.184 |
| 0.7604166666666666 | 105.69 |
| 0.7611111111111111 | 110.201 |
| 0.7618055555555556 | 114.716 |
| 0.7625000000000001 | 119.235 |
| 0.7631944444444444 | 128.284 |
| 0.7638888888888888 | 132.814 |
| 0.7645833333333334 | 128.284 |
| 0.7652777777777778 | 119.235 |
| 0.7659722222222222 | 123.758 |
| 0.7666666666666666 | 132.814 |
| 0.7673611111111112 | 137.347 |
| 0.7680555555555556 | 141.884 |
| 0.7687499999999999 | 160.056 |
| 0.7694444444444444 | 164.605 |
| 0.7701388888888889 | 164.605 |
| 0.7708333333333334 | 160.056 |
| 0.7715277777777777 | 155.509 |
| 0.7722222222222223 | 164.605 |
| 0.7729166666666667 | 169.156 |
| 0.7736111111111111 | 178.264 |
| 0.7743055555555555 | 178.264 |
| 0.775 | 178.264 |
| 0.7756944444444445 | 178.264 |
| 0.7763888888888889 | 178.264 |
| 0.7770833333333332 | 173.709 |
| 0.7777777777777778 | 169.156 |
| 0.7784722222222222 | 160.056 |
| 0.7791666666666667 | 150.964 |
| 0.779861111111111 | 141.884 |
| 0.7805555555555556 | 141.884 |
| 0.78125 | 141.884 |
| 0.7819444444444444 | 141.884 |
| 0.782638888888889 | 141.884 |
| 0.7833333333333333 | 141.884 |
| 0.7840277777777778 | 137.347 |
| 0.7847222222222222 | 137.347 |
| 0.7854166666666668 | 132.814 |
| 0.7861111111111111 | 128.284 |
| 0.7868055555555555 | 123.758 |
| 0.7875 | 119.235 |
| 0.7881944444444445 | 119.235 |
| 0.7888888888888889 | 119.235 |
| 0.7895833333333333 | 110.201 |
| 0.7902777777777777 | 105.69 |
| 0.7909722222222223 | 105.69 |
| 0.7916666666666666 | 101.184 |
| 0.7923611111111111 | 96.682 |
| 0.7930555555555556 | 96.682 |
| 0.7937500000000001 | 96.682 |
| 0.7944444444444444 | 92.184 |
| 0.7951388888888888 | 96.682 |
| 0.7958333333333334 | 96.682 |
| 0.7965277777777778 | 96.682 |
| 0.7972222222222222 | 92.184 |
| 0.7979166666666666 | 83.205 |
| 0.7986111111111112 | 78.722 |
| 0.7993055555555556 | 69.775 |
| 0.7999999999999999 | 60.85 |
| 0.8006944444444444 | 51.951 |
| 0.8013888888888889 | 43.079 |
| 0.8020833333333334 | 34.234 |
| 0.8027777777777777 | 25.419 |
| 0.8034722222222223 | 21.024 |
| 0.8041666666666667 | 12.257 |
| 0.8048611111111111 | 12.257 |
| 0.8055555555555555 | 7.887 |
| 0.80625 | 7.887 |
| 0.8069444444444445 | 7.887 |
| 0.8076388888888889 | 7.887 |
| 0.8083333333333332 | 7.887 |
| 0.8090277777777778 | 7.887 |
| 0.8097222222222222 | 7.887 |
| 0.8104166666666667 | 12.257 |
| 0.811111111111111 | 12.257 |
| 0.8118055555555556 | 12.257 |
| 0.8125 | 12.257 |
| 0.8131944444444444 | 12.257 |
| 0.813888888888889 | 12.257 |
| 0.8145833333333333 | 7.887 |
| 0.8152777777777778 | 7.887 |
| 0.8159722222222222 | 7.887 |
| 0.8166666666666668 | 7.887 |
| 0.8173611111111111 | 7.887 |
| 0.8180555555555555 | 3.525 |
| 0.81875 | 3.525 |
| 0.8194444444444445 | 3.525 |
| 0.8201388888888889 | 3.525 |
| 0.8208333333333333 | 3.525 |
| 0.8215277777777777 | 3.525 |
| 0.8222222222222223 | 3.525 |
| 0.8229166666666666 | 3.525 |
| 0.8236111111111111 | 3.525 |
| 0.8243055555555556 | 3.525 |
| 0.8250000000000001 | 3.525 |
| 0.8256944444444444 | 3.525 |
| 0.8263888888888888 | 3.525 |
| 0.8270833333333334 | 0 |
| 0.8277777777777778 | 0 |
| 0.8284722222222222 | 0 |
| 0.8291666666666666 | 0 |
| 0.8298611111111112 | 0 |
| 0.8305555555555556 | 0 |
| 0.8312499999999999 | 0 |
| 0.8319444444444444 | 0 |
| 0.8326388888888889 | 0 |
| 0.8333333333333334 | 0 |
| 0.8340277777777777 | 0 |
| 0.8347222222222223 | 0 |
| 0.8354166666666667 | 0 |
| 0.8361111111111111 | 0 |
| 0.8368055555555555 | 0 |
| 0.8375 | 0 |
| 0.8381944444444445 | 0 |
| 0.8388888888888889 | 0 |
| 0.8395833333333332 | 0 |
| 0.8402777777777778 | 0 |
| 0.8409722222222222 | 0 |
| 0.8416666666666667 | 0 |
| 0.842361111111111 | 0 |
| 0.8430555555555556 | 0 |
| 0.84375 | 0 |
| 0.8444444444444444 | 0 |
| 0.845138888888889 | 0 |
| 0.8458333333333333 | 0 |
| 0.8465277777777778 | 0 |
| 0.8472222222222222 | 0 |
| 0.8479166666666668 | 0 |
| 0.8486111111111111 | 0 |
| 0.8493055555555555 | 0 |
| 0.85 | 0 |
| 0.8506944444444445 | 0 |
| 0.8513888888888889 | 0 |
| 0.8520833333333333 | 0 |
| 0.8527777777777777 | 0 |
| 0.8534722222222223 | 0 |
| 0.8541666666666666 | 0 |
| 0.8548611111111111 | 0 |
| 0.8555555555555556 | 0 |
| 0.8562500000000001 | 0 |
| 0.8569444444444444 | 0 |
| 0.8576388888888888 | 0 |
| 0.8583333333333334 | 0 |
| 0.8590277777777778 | 0 |
| 0.8597222222222222 | 0 |
| 0.8604166666666666 | 0 |
| 0.8611111111111112 | 0 |
| 0.8618055555555556 | 0 |
| 0.8624999999999999 | 0 |
| 0.8631944444444444 | 0 |
| 0.8638888888888889 | 0 |
| 0.8645833333333334 | 0 |
| 0.8652777777777777 | 0 |
| 0.8659722222222223 | 0 |
| 0.8666666666666667 | 0 |
| 0.8673611111111111 | 0 |
| 0.8680555555555555 | 0 |
| 0.86875 | 0 |
| 0.8694444444444445 | 0 |
| 0.8701388888888889 | 0 |
| 0.8708333333333332 | 0 |
| 0.8715277777777778 | 0 |
| 0.8722222222222222 | 0 |
| 0.8729166666666667 | 0 |
| 0.873611111111111 | 0 |
| 0.8743055555555556 | 0 |
| 0.875 | 0 |
| 0.8756944444444444 | 0 |
| 0.876388888888889 | 0 |
| 0.8770833333333333 | 0 |
| 0.8777777777777778 | 0 |
| 0.8784722222222222 | 0 |
| 0.8791666666666668 | 0 |
| 0.8798611111111111 | 0 |
| 0.8805555555555555 | 0 |
| 0.88125 | 0 |
| 0.8819444444444445 | 0 |
| 0.8826388888888889 | 0 |
| 0.8833333333333333 | 0 |
| 0.8840277777777777 | 0 |
| 0.8847222222222223 | 0 |
| 0.8854166666666666 | 0 |
| 0.8861111111111111 | 0 |
| 0.8868055555555556 | 0 |
| 0.8875000000000001 | 0 |
| 0.8881944444444444 | 0 |
| 0.8888888888888888 | 0 |
| 0.8895833333333334 | 0 |
| 0.8902777777777778 | 0 |
| 0.8909722222222222 | 0 |
| 0.8916666666666666 | 0 |
| 0.8923611111111112 | 0 |
| 0.8930555555555556 | 0 |
| 0.8937499999999999 | 0 |
| 0.8944444444444444 | 0 |
| 0.8951388888888889 | 0 |
| 0.8958333333333334 | 0 |
| 0.8965277777777777 | 0 |
| 0.8972222222222223 | 0 |
| 0.8979166666666667 | 0 |
| 0.8986111111111111 | 0 |
| 0.8993055555555555 | 0 |
| 0.9 | 0 |
| 0.9006944444444445 | 0 |
| 0.9013888888888889 | 0 |
| 0.9020833333333332 | 0 |
| 0.9027777777777778 | 0 |
| 0.9034722222222222 | 0 |
| 0.9041666666666667 | 0 |
| 0.904861111111111 | 0 |
| 0.9055555555555556 | 0 |
| 0.90625 | 0 |
| 0.9069444444444444 | 0 |
| 0.907638888888889 | 0 |
| 0.9083333333333333 | 0 |
| 0.9090277777777778 | 0 |
| 0.9097222222222222 | 0 |
| 0.9104166666666668 | 0 |
| 0.9111111111111111 | 0 |
| 0.9118055555555555 | 0 |
| 0.9125 | 0 |
| 0.9131944444444445 | 0 |
| 0.9138888888888889 | 0 |
| 0.9145833333333333 | 0 |
| 0.9152777777777777 | 0 |
| 0.9159722222222223 | 0 |
| 0.9166666666666666 | 0 |
| 0.9173611111111111 | 0 |
| 0.9180555555555556 | 0 |
| 0.9187500000000001 | 0 |
| 0.9194444444444444 | 0 |
| 0.9201388888888888 | 0 |
| 0.9208333333333334 | 0 |
| 0.9215277777777778 | 0 |
| 0.9222222222222222 | 0 |
| 0.9229166666666666 | 0 |
| 0.9236111111111112 | 0 |
| 0.9243055555555556 | 0 |
| 0.9249999999999999 | 0 |
| 0.9256944444444444 | 0 |
| 0.9263888888888889 | 0 |
| 0.9270833333333334 | 0 |
| 0.9277777777777777 | 0 |
| 0.9284722222222223 | 0 |
| 0.9291666666666667 | 0 |
| 0.9298611111111111 | 0 |
| 0.9305555555555555 | 0 |
| 0.93125 | 0 |
| 0.9319444444444445 | 0 |
| 0.9326388888888889 | 0 |
| 0.9333333333333332 | 0 |
| 0.9340277777777778 | 0 |
| 0.9347222222222222 | 0 |
| 0.9354166666666667 | 0 |
| 0.936111111111111 | 0 |
| 0.9368055555555556 | 0 |
| 0.9375 | 0 |
| 0.9381944444444444 | 0 |
| 0.938888888888889 | 0 |
| 0.9395833333333333 | 0 |
| 0.9402777777777778 | 0 |
| 0.9409722222222222 | 0 |
| 0.9416666666666668 | 0 |
| 0.9423611111111111 | 0 |
| 0.9430555555555555 | 0 |
| 0.94375 | 0 |
| 0.9444444444444445 | 0 |
| 0.9451388888888889 | 0 |
| 0.9458333333333333 | 0 |
| 0.9465277777777777 | 0 |
| 0.9472222222222223 | 0 |
| 0.9479166666666666 | 0 |
| 0.9486111111111111 | 0 |
| 0.9493055555555556 | 0 |
| 0.9500000000000001 | 0 |
| 0.9506944444444444 | 0 |
| 0.9513888888888888 | 0 |
| 0.9520833333333334 | 0 |
| 0.9527777777777778 | 0 |
| 0.9534722222222222 | 0 |
| 0.9541666666666666 | 0 |
| 0.9548611111111112 | 0 |
| 0.9555555555555556 | 0 |
| 0.9562499999999999 | 0 |
| 0.9569444444444444 | 0 |
| 0.9576388888888889 | 0 |
| 0.9583333333333334 | 0 |
| 0.9590277777777777 | 0 |
| 0.9597222222222223 | 0 |
| 0.9604166666666667 | 0 |
| 0.9611111111111111 | 0 |
| 0.9618055555555555 | 0 |
| 0.9625 | 0 |
| 0.9631944444444445 | 0 |
| 0.9638888888888889 | 0 |
| 0.9645833333333332 | 0 |
| 0.9652777777777778 | 0 |
| 0.9659722222222222 | 0 |
| 0.9666666666666667 | 0 |
| 0.967361111111111 | 0 |
| 0.9680555555555556 | 0 |
| 0.96875 | 0 |
| 0.9694444444444444 | 0 |
| 0.970138888888889 | 0 |
| 0.9708333333333333 | 0 |
| 0.9715277777777778 | 0 |
| 0.9722222222222222 | 0 |
| 0.9729166666666668 | 0 |
| 0.9736111111111111 | 0 |
| 0.9743055555555555 | 0 |
| 0.975 | 0 |
| 0.9756944444444445 | 0 |
| 0.9763888888888889 | 0 |
| 0.9770833333333333 | 0 |
| 0.9777777777777777 | 0 |
| 0.9784722222222223 | 0 |
| 0.9791666666666666 | 0 |
| 0.9798611111111111 | 0 |
| 0.9805555555555556 | 0 |
| 0.9812500000000001 | 0 |
| 0.9819444444444444 | 0 |
| 0.9826388888888888 | 0 |
| 0.9833333333333334 | 0 |
| 0.9840277777777778 | 0 |
| 0.9847222222222222 | 0 |
| 0.9854166666666666 | 0 |
| 0.9861111111111112 | 0 |
| 0.9868055555555556 | 0 |
| 0.9874999999999999 | 0 |
| 0.9881944444444444 | 0 |
| 0.9888888888888889 | 0 |
| 0.9895833333333334 | 0 |
| 0.9902777777777777 | 0 |
| 0.9909722222222223 | 0 |
| 0.9916666666666667 | 0 |
| 0.9923611111111111 | 0 |
| 0.9930555555555555 | 0 |
| 0.99375 | 0 |
| 0.9944444444444445 | 0 |
| 0.9951388888888889 | 0 |
| 0.9958333333333332 | 0 |
| 0.9965277777777778 | 0 |
| 0.9972222222222222 | 0 |
| 0.9979166666666667 | 0 |
| 0.998611111111111 | 0 |
| 0.9993055555555556 | 0 |